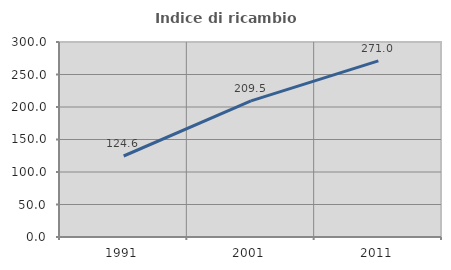
| Category | Indice di ricambio occupazionale  |
|---|---|
| 1991.0 | 124.615 |
| 2001.0 | 209.524 |
| 2011.0 | 271.038 |